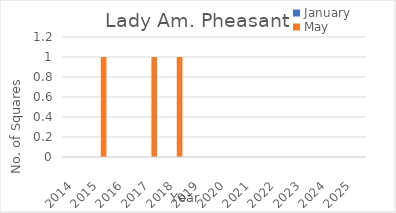
| Category | January | May |
|---|---|---|
| 2014.0 | 0 | 0 |
| 2015.0 | 0 | 1 |
| 2016.0 | 0 | 0 |
| 2017.0 | 0 | 1 |
| 2018.0 | 0 | 1 |
| 2019.0 | 0 | 0 |
| 2020.0 | 0 | 0 |
| 2021.0 | 0 | 0 |
| 2022.0 | 0 | 0 |
| 2023.0 | 0 | 0 |
| 2024.0 | 0 | 0 |
| 2025.0 | 0 | 0 |